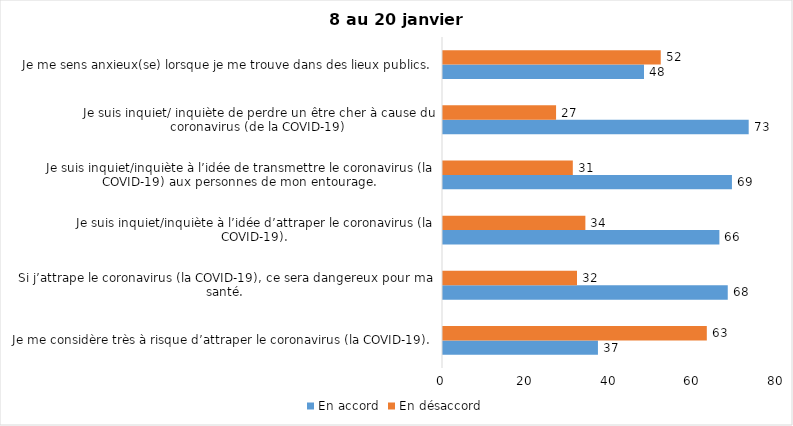
| Category | En accord | En désaccord |
|---|---|---|
| Je me considère très à risque d’attraper le coronavirus (la COVID-19). | 37 | 63 |
| Si j’attrape le coronavirus (la COVID-19), ce sera dangereux pour ma santé. | 68 | 32 |
| Je suis inquiet/inquiète à l’idée d’attraper le coronavirus (la COVID-19). | 66 | 34 |
| Je suis inquiet/inquiète à l’idée de transmettre le coronavirus (la COVID-19) aux personnes de mon entourage. | 69 | 31 |
| Je suis inquiet/ inquiète de perdre un être cher à cause du coronavirus (de la COVID-19) | 73 | 27 |
| Je me sens anxieux(se) lorsque je me trouve dans des lieux publics. | 48 | 52 |